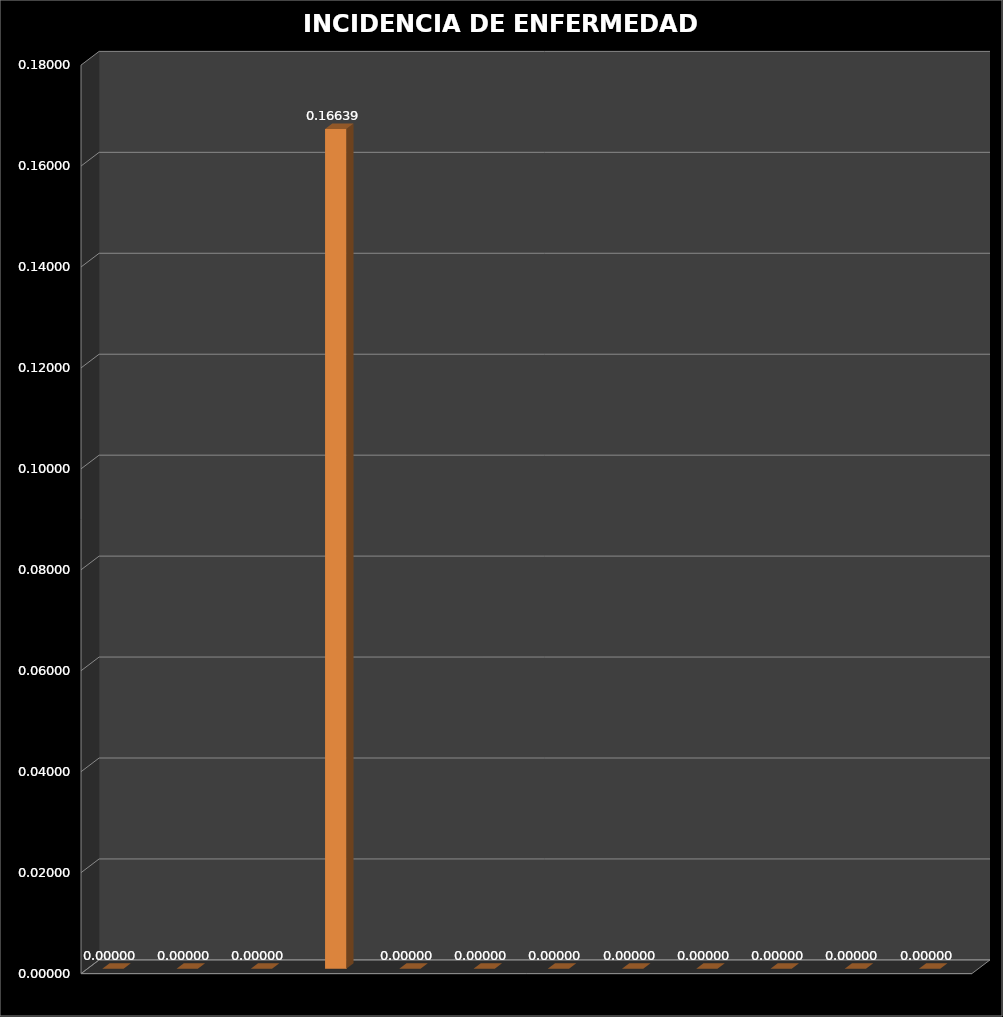
| Category | Series 0 | Series 1 |
|---|---|---|
| ENE | 0 |  |
| FEB | 0 |  |
| MAR | 0 |  |
| ABR | 0.166 |  |
| MAY | 0 |  |
| JUN | 0 |  |
| JUL | 0 |  |
| AGO | 0 |  |
| SEP | 0 |  |
| OCT | 0 |  |
| NOV | 0 |  |
| DIC | 0 |  |